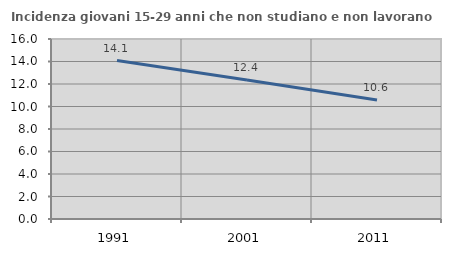
| Category | Incidenza giovani 15-29 anni che non studiano e non lavorano  |
|---|---|
| 1991.0 | 14.085 |
| 2001.0 | 12.363 |
| 2011.0 | 10.571 |